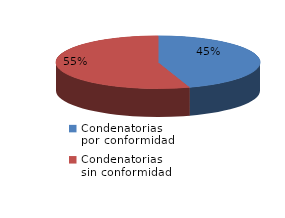
| Category | Series 0 |
|---|---|
| 0 | 9 |
| 1 | 11 |